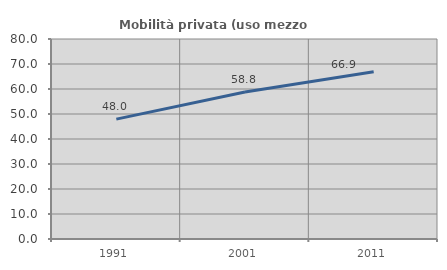
| Category | Mobilità privata (uso mezzo privato) |
|---|---|
| 1991.0 | 47.962 |
| 2001.0 | 58.824 |
| 2011.0 | 66.905 |